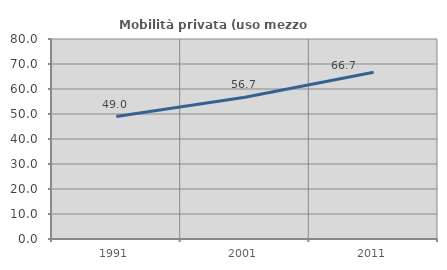
| Category | Mobilità privata (uso mezzo privato) |
|---|---|
| 1991.0 | 48.988 |
| 2001.0 | 56.733 |
| 2011.0 | 66.728 |